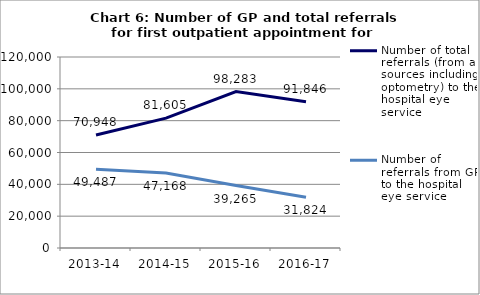
| Category | Number of total referrals (from all sources including optometry) to the hospital eye service | Number of referrals from GPs to the hospital eye service |
|---|---|---|
| 2013-14 | 70948 | 49487 |
| 2014-15 | 81605 | 47168 |
| 2015-16 | 98283 | 39265 |
| 2016-17 | 91846 | 31824 |